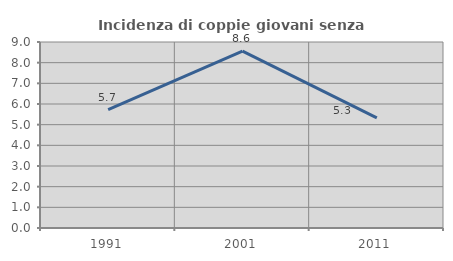
| Category | Incidenza di coppie giovani senza figli |
|---|---|
| 1991.0 | 5.729 |
| 2001.0 | 8.559 |
| 2011.0 | 5.331 |